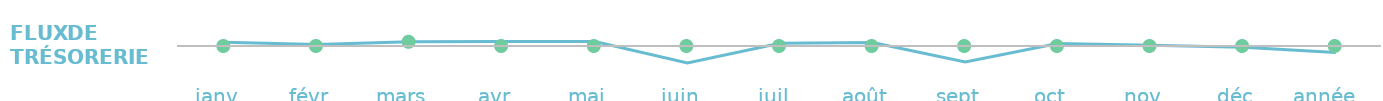
| Category | Flux de trésorerie |
|---|---|
| janv  | 169 |
| févr  | 69 |
| mars  | 192 |
| avr  | 199 |
| mai  | 204 |
| juin  | -771 |
| juil  | 124 |
| août  | 154 |
| sept  | -721 |
| oct  | 109 |
| nov  | 34 |
| déc  | -61 |
| année   | -299 |